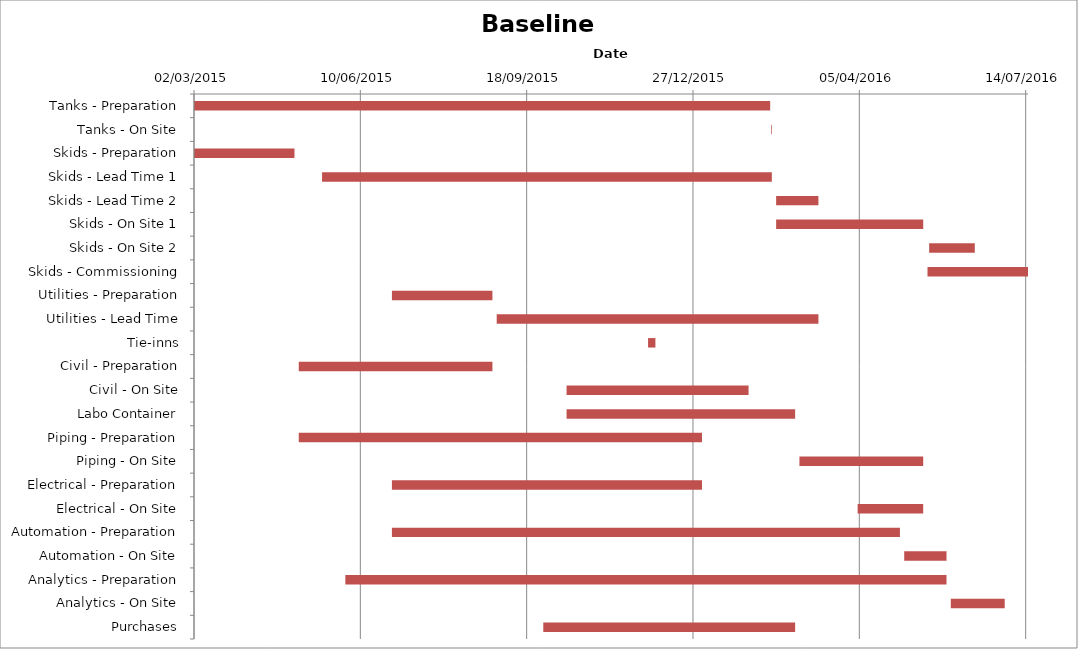
| Category | Baseline start | Actual duration |
|---|---|---|
| Tanks - Preparation | 42065.292 | 346.417 |
| Tanks - On Site | 42412.292 | 0.417 |
| Skids - Preparation | 42065.292 | 60.417 |
| Skids - Lead Time 1 | 42142.292 | 270.417 |
| Skids - Lead Time 2 | 42415.292 | 25.417 |
| Skids - On Site 1 | 42415.292 | 88.417 |
| Skids - On Site 2 | 42507.292 | 27.417 |
| Skids - Commissioning | 42506.292 | 60.417 |
| Utilities - Preparation | 42184.292 | 60.417 |
| Utilities - Lead Time | 42247.292 | 193.417 |
| Tie-inns | 42338.292 | 4.417 |
| Civil - Preparation | 42128.292 | 116.417 |
| Civil - On Site | 42289.292 | 109.417 |
| Labo Container | 42289.292 | 137.417 |
| Piping - Preparation | 42128.292 | 242.417 |
| Piping - On Site | 42429.292 | 74.417 |
| Electrical - Preparation | 42184.292 | 186.417 |
| Electrical - On Site | 42464.292 | 39.417 |
| Automation - Preparation | 42184.292 | 305.417 |
| Automation - On Site | 42492.292 | 25.417 |
| Analytics - Preparation | 42156.292 | 361.417 |
| Analytics - On Site | 42520.292 | 32.417 |
| Purchases | 42275.292 | 151.417 |